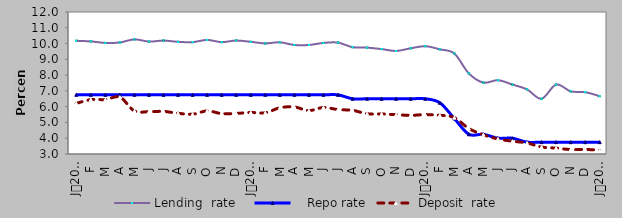
| Category | Lending  rate |    Repo rate | Deposit  rate |
|---|---|---|---|
| 0 | 10.174 | 6.75 | 6.207 |
| 1900-01-01 | 10.136 | 6.75 | 6.446 |
| 1900-01-02 | 10.04 | 6.75 | 6.45 |
| 1900-01-03 | 10.07 | 6.75 | 6.6 |
| 1900-01-04 | 10.265 | 6.75 | 5.728 |
| 1900-01-05 | 10.125 | 6.75 | 5.682 |
| 1900-01-06 | 10.19 | 6.75 | 5.7 |
| 1900-01-07 | 10.11 | 6.75 | 5.58 |
| 1900-01-08 | 10.09 | 6.75 | 5.52 |
| 1900-01-09 | 10.23 | 6.75 | 5.73 |
| 1900-01-10 | 10.09 | 6.75 | 5.56 |
| 1900-01-11 | 10.192 | 6.75 | 5.572 |
| 1900-01-12 | 10.11 | 6.75 | 5.63 |
| 1900-01-13 | 10.01 | 6.75 | 5.61 |
| 1900-01-14 | 10.08 | 6.75 | 5.93 |
| 1900-01-15 | 9.91 | 6.75 | 5.98 |
| 1900-01-16 | 9.91 | 6.75 | 5.75 |
| 1900-01-17 | 10.04 | 6.75 | 5.95 |
| 1900-01-18 | 10.06 | 6.75 | 5.813 |
| 1900-01-19 | 9.77 | 6.5 | 5.77 |
| 1900-01-20 | 9.74 | 6.5 | 5.55 |
| 1900-01-21 | 9.65 | 6.5 | 5.54 |
| 1900-01-22 | 9.53 | 6.5 | 5.49 |
| 1900-01-23 | 9.7 | 6.5 | 5.45 |
| 1900-01-24 | 9.833 | 6.5 | 5.497 |
| 1900-01-25 | 9.634 | 6.25 | 5.454 |
| 1900-01-26 | 9.369 | 5.25 | 5.304 |
| 1900-01-27 | 8.106 | 4.25 | 4.617 |
| 1900-01-28 | 7.526 | 4.25 | 4.216 |
| 1900-01-29 | 7.679 | 4 | 3.952 |
| 1900-01-30 | 7.4 | 4 | 3.81 |
| 1900-01-31 | 7.095 | 3.75 | 3.699 |
| 1900-02-01 | 6.5 | 3.75 | 3.44 |
| 1900-02-02 | 7.402 | 3.75 | 3.374 |
| 1900-02-03 | 6.97 | 3.75 | 3.28 |
| 1900-02-04 | 6.92 | 3.75 | 3.29 |
| 1900-02-05 | 6.663 | 3.75 | 3.236 |